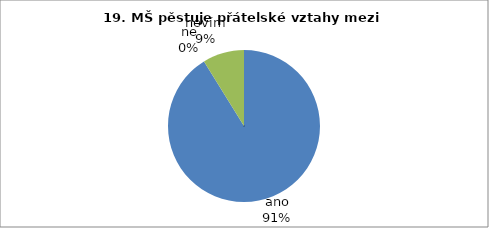
| Category | 19. |
|---|---|
| ano | 31 |
| ne | 0 |
| nevím | 3 |